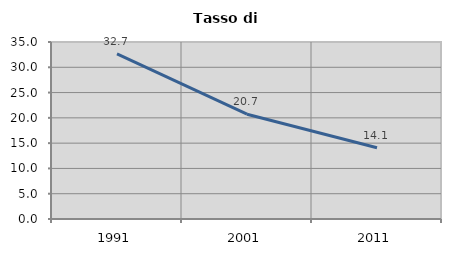
| Category | Tasso di disoccupazione   |
|---|---|
| 1991.0 | 32.666 |
| 2001.0 | 20.724 |
| 2011.0 | 14.091 |